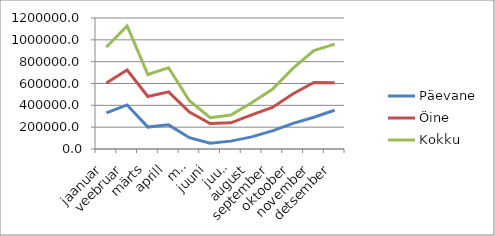
| Category | Päevane | Öine | Kokku |
|---|---|---|---|
| jaanuar | 330467.2 | 604264.9 | 934732.1 |
| veebruar | 403642.8 | 723305.4 | 1126948.2 |
| märts | 200902.7 | 481185.4 | 682088.1 |
| aprill | 221200.4 | 523582.1 | 744782.5 |
| mai | 103718.4 | 338490.3 | 442208.7 |
| juuni | 52959.8 | 234095.8 | 287055.6 |
| juuli | 72189.4 | 239594.7 | 311784.1 |
| august | 111051.8 | 312776.6 | 423828.4 |
| september | 166322.5 | 380755.7 | 547078.2 |
| oktoober | 234611.3 | 505987.7 | 740599 |
| november | 291303.3 | 609796 | 901099.3 |
| detsember | 354828.5 | 606310.2 | 961138.7 |